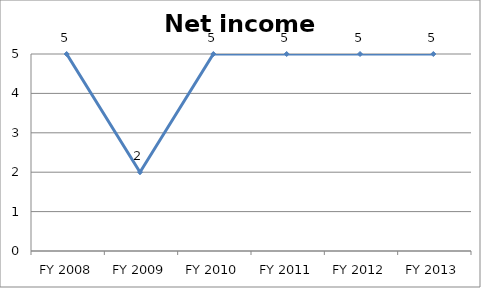
| Category | Net income score |
|---|---|
| FY 2013 | 5 |
| FY 2012 | 5 |
| FY 2011 | 5 |
| FY 2010 | 5 |
| FY 2009 | 2 |
| FY 2008 | 5 |